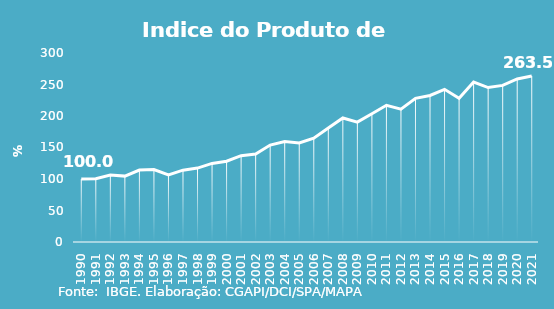
| Category | Indice de Prod. base 1990 |
|---|---|
| 1990.0 | 100 |
| 1991.0 | 100.275 |
| 1992.0 | 106.203 |
| 1993.0 | 104.57 |
| 1994.0 | 114.164 |
| 1995.0 | 115.024 |
| 1996.0 | 106.552 |
| 1997.0 | 114.037 |
| 1998.0 | 117.319 |
| 1999.0 | 124.734 |
| 2000.0 | 128.293 |
| 2001.0 | 136.975 |
| 2002.0 | 139.51 |
| 2003.0 | 153.868 |
| 2004.0 | 159.641 |
| 2005.0 | 157.136 |
| 2006.0 | 164.858 |
| 2007.0 | 180.781 |
| 2008.0 | 196.91 |
| 2009.0 | 190.309 |
| 2010.0 | 203.581 |
| 2011.0 | 217.041 |
| 2012.0 | 210.932 |
| 2013.0 | 228.009 |
| 2014.0 | 232.562 |
| 2015.0 | 242.318 |
| 2016.0 | 228.239 |
| 2017.0 | 253.826 |
| 2018.0 | 245.134 |
| 2019.0 | 248.619 |
| 2020.0 | 258.848 |
| 2021.0 | 263.546 |